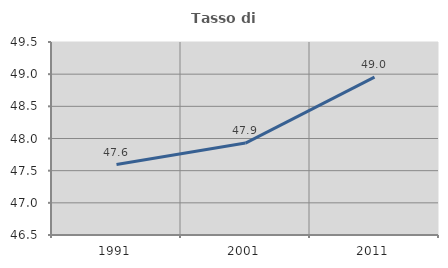
| Category | Tasso di occupazione   |
|---|---|
| 1991.0 | 47.596 |
| 2001.0 | 47.929 |
| 2011.0 | 48.953 |